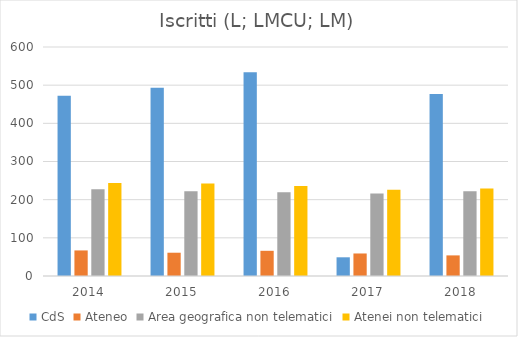
| Category | CdS | Ateneo | Area geografica non telematici | Atenei non telematici |
|---|---|---|---|---|
| 2014.0 | 472 | 67 | 227.1 | 243.9 |
| 2015.0 | 493 | 61 | 221.8 | 242.5 |
| 2016.0 | 534 | 66 | 219.7 | 235.9 |
| 2017.0 | 49 | 59 | 216.2 | 226.3 |
| 2018.0 | 477 | 54 | 222.2 | 229.3 |